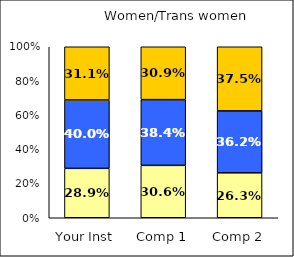
| Category | Low Civic Minded Practice | Average Civic Minded Practice | High Civic Minded Practice |
|---|---|---|---|
| Your Inst | 0.289 | 0.4 | 0.311 |
| Comp 1 | 0.306 | 0.384 | 0.309 |
| Comp 2 | 0.263 | 0.362 | 0.375 |